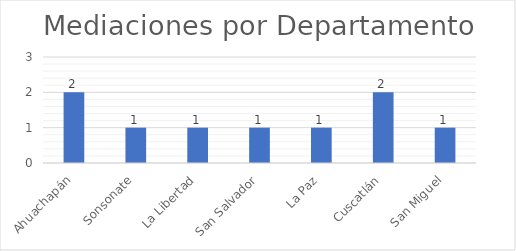
| Category | Mediaciones |
|---|---|
| Ahuachapán | 2 |
| Sonsonate | 1 |
| La Libertad | 1 |
| San Salvador | 1 |
| La Paz | 1 |
| Cuscatlán | 2 |
| San Miguel | 1 |